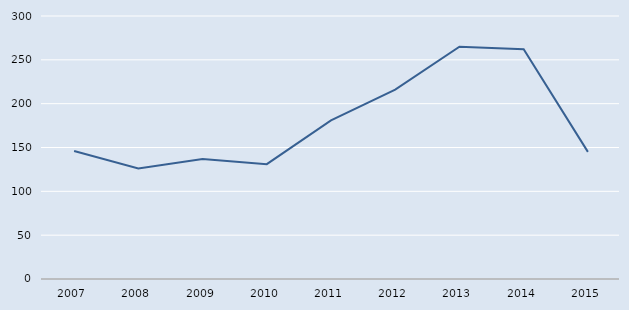
| Category | Series 0 |
|---|---|
| 2007.0 | 146 |
| 2008.0 | 126 |
| 2009.0 | 137 |
| 2010.0 | 131 |
| 2011.0 | 181 |
| 2012.0 | 216 |
| 2013.0 | 265 |
| 2014.0 | 262 |
| 2015.0 | 145 |